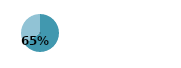
| Category | Series 0 |
|---|---|
| 0 | 0.653 |
| 1 | 0.347 |